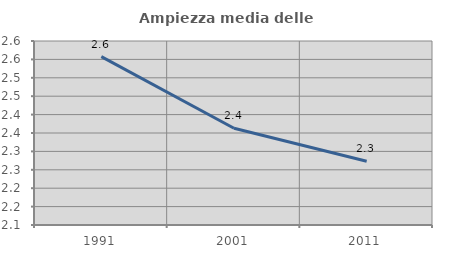
| Category | Ampiezza media delle famiglie |
|---|---|
| 1991.0 | 2.557 |
| 2001.0 | 2.363 |
| 2011.0 | 2.273 |